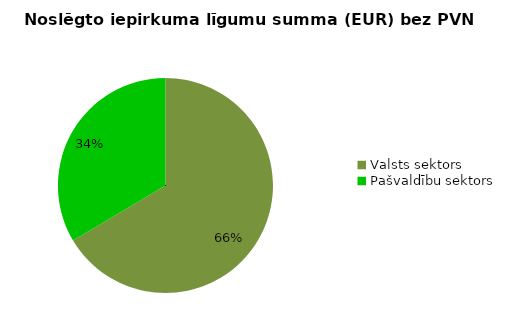
| Category | Noslēgto iepirkuma līgumu summa (EUR) bez PVN |
|---|---|
| Valsts sektors | 21116993 |
| Pašvaldību sektors | 10651217 |